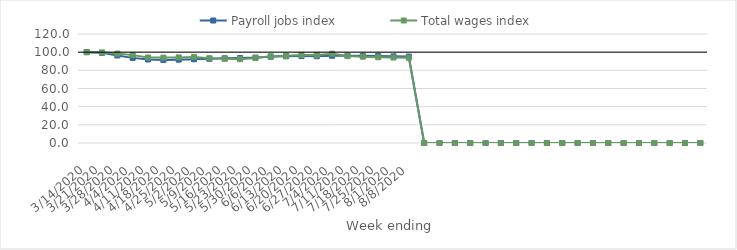
| Category | Payroll jobs index | Total wages index |
|---|---|---|
| 14/03/2020 | 100 | 100 |
| 21/03/2020 | 99.296 | 99.679 |
| 28/03/2020 | 96.376 | 98.416 |
| 04/04/2020 | 93.719 | 96.743 |
| 11/04/2020 | 91.949 | 94.153 |
| 18/04/2020 | 91.46 | 94.028 |
| 25/04/2020 | 91.774 | 94.242 |
| 02/05/2020 | 92.164 | 94.699 |
| 09/05/2020 | 92.706 | 93.349 |
| 16/05/2020 | 93.235 | 92.689 |
| 23/05/2020 | 93.534 | 92.291 |
| 30/05/2020 | 94.056 | 93.572 |
| 06/06/2020 | 94.996 | 95.371 |
| 13/06/2020 | 95.462 | 96.012 |
| 20/06/2020 | 95.685 | 96.877 |
| 27/06/2020 | 95.589 | 96.891 |
| 04/07/2020 | 96.048 | 98.279 |
| 11/07/2020 | 96.137 | 95.659 |
| 18/07/2020 | 95.918 | 95.021 |
| 25/07/2020 | 95.887 | 94.374 |
| 01/08/2020 | 95.429 | 94.068 |
| 08/08/2020 | 95.147 | 93.816 |